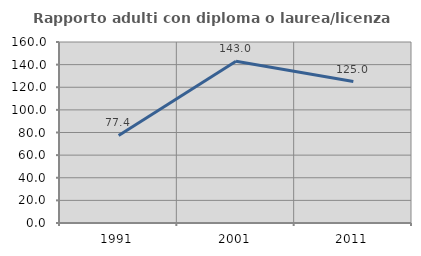
| Category | Rapporto adulti con diploma o laurea/licenza media  |
|---|---|
| 1991.0 | 77.404 |
| 2001.0 | 143.001 |
| 2011.0 | 125.012 |